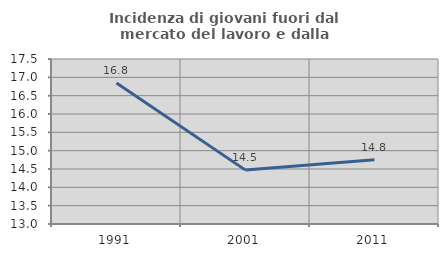
| Category | Incidenza di giovani fuori dal mercato del lavoro e dalla formazione  |
|---|---|
| 1991.0 | 16.848 |
| 2001.0 | 14.469 |
| 2011.0 | 14.754 |